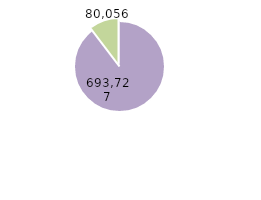
| Category | Series 0 |
|---|---|
| Mujeres | 693727 |
| Hombres | 80056 |